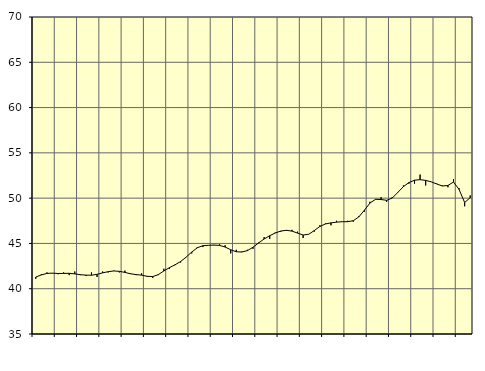
| Category | Piggar | Samtliga fast anställda (inkl. fast anställda utomlands) |
|---|---|---|
| nan | 41.1 | 41.29 |
| 1.0 | 41.6 | 41.52 |
| 1.0 | 41.8 | 41.69 |
| 1.0 | 41.7 | 41.72 |
| nan | 41.6 | 41.68 |
| 2.0 | 41.8 | 41.69 |
| 2.0 | 41.5 | 41.7 |
| 2.0 | 41.9 | 41.64 |
| nan | 41.5 | 41.55 |
| 3.0 | 41.4 | 41.5 |
| 3.0 | 41.8 | 41.49 |
| 3.0 | 41.3 | 41.59 |
| nan | 41.9 | 41.75 |
| 4.0 | 41.8 | 41.88 |
| 4.0 | 42 | 41.96 |
| 4.0 | 41.8 | 41.92 |
| nan | 42 | 41.8 |
| 5.0 | 41.7 | 41.65 |
| 5.0 | 41.5 | 41.56 |
| 5.0 | 41.7 | 41.5 |
| nan | 41.3 | 41.37 |
| 6.0 | 41.2 | 41.34 |
| 6.0 | 41.5 | 41.56 |
| 6.0 | 42.2 | 41.96 |
| nan | 42.2 | 42.33 |
| 7.0 | 42.6 | 42.64 |
| 7.0 | 42.9 | 43 |
| 7.0 | 43.5 | 43.49 |
| nan | 43.9 | 44.05 |
| 8.0 | 44.6 | 44.52 |
| 8.0 | 44.6 | 44.75 |
| 8.0 | 44.8 | 44.79 |
| nan | 44.8 | 44.82 |
| 9.0 | 44.9 | 44.78 |
| 9.0 | 44.8 | 44.6 |
| 9.0 | 43.9 | 44.3 |
| nan | 44.3 | 44.08 |
| 10.0 | 44.1 | 44.05 |
| 10.0 | 44.3 | 44.21 |
| 10.0 | 44.4 | 44.58 |
| nan | 45.1 | 45.05 |
| 11.0 | 45.7 | 45.49 |
| 11.0 | 45.5 | 45.85 |
| 11.0 | 46.2 | 46.15 |
| nan | 46.3 | 46.37 |
| 12.0 | 46.4 | 46.45 |
| 12.0 | 46.5 | 46.36 |
| 12.0 | 46.3 | 46.14 |
| nan | 45.6 | 45.93 |
| 13.0 | 46 | 46.01 |
| 13.0 | 46.3 | 46.42 |
| 13.0 | 47 | 46.87 |
| nan | 47.2 | 47.15 |
| 14.0 | 47 | 47.27 |
| 14.0 | 47.5 | 47.35 |
| 14.0 | 47.4 | 47.4 |
| nan | 47.5 | 47.4 |
| 15.0 | 47.4 | 47.51 |
| 15.0 | 48 | 47.93 |
| 15.0 | 48.5 | 48.66 |
| nan | 49.6 | 49.46 |
| 16.0 | 49.9 | 49.87 |
| 16.0 | 50.1 | 49.85 |
| 16.0 | 49.6 | 49.76 |
| nan | 50.1 | 50.01 |
| 17.0 | 50.6 | 50.63 |
| 17.0 | 51.4 | 51.27 |
| 17.0 | 51.6 | 51.72 |
| nan | 51.6 | 51.98 |
| 18.0 | 52.6 | 52.04 |
| 18.0 | 51.4 | 51.96 |
| 18.0 | 51.8 | 51.8 |
| nan | 51.6 | 51.56 |
| 19.0 | 51.4 | 51.34 |
| 19.0 | 51.2 | 51.4 |
| 19.0 | 52.1 | 51.78 |
| nan | 51.1 | 50.96 |
| 20.0 | 49.1 | 49.52 |
| 20.0 | 50.3 | 50.05 |